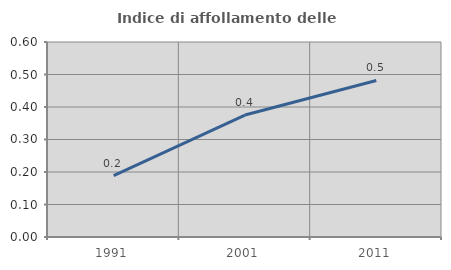
| Category | Indice di affollamento delle abitazioni  |
|---|---|
| 1991.0 | 0.189 |
| 2001.0 | 0.375 |
| 2011.0 | 0.482 |